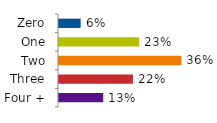
| Category | Series 0 |
|---|---|
| Four + | 0.129 |
| Three | 0.216 |
| Two | 0.357 |
| One | 0.234 |
| Zero | 0.063 |